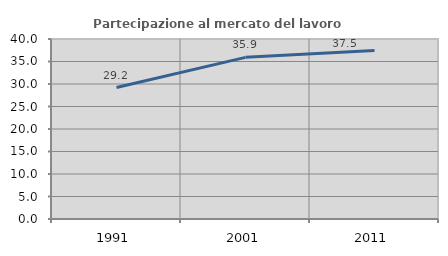
| Category | Partecipazione al mercato del lavoro  femminile |
|---|---|
| 1991.0 | 29.216 |
| 2001.0 | 35.917 |
| 2011.0 | 37.465 |